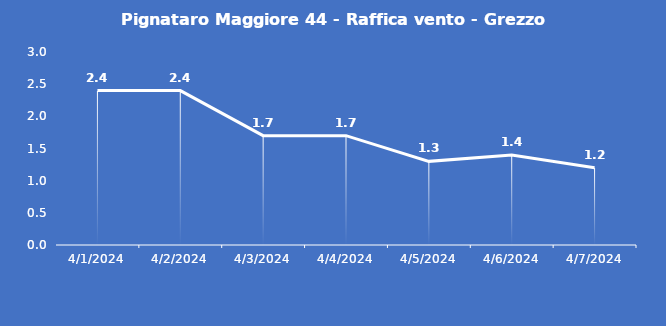
| Category | Pignataro Maggiore 44 - Raffica vento - Grezzo (m/s) |
|---|---|
| 4/1/24 | 2.4 |
| 4/2/24 | 2.4 |
| 4/3/24 | 1.7 |
| 4/4/24 | 1.7 |
| 4/5/24 | 1.3 |
| 4/6/24 | 1.4 |
| 4/7/24 | 1.2 |